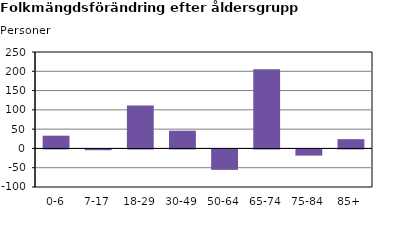
| Category | Series 2 |
|---|---|
| 0-6 | 33 |
| 7-17 | -2 |
| 18-29 | 111 |
| 30-49 | 46 |
| 50-64 | -53 |
| 65-74 | 205 |
| 75-84 | -16 |
| 85+ | 24 |